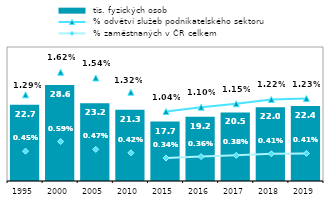
| Category |  tis. fyzických osob |
|---|---|
| 1995.0 | 22.729 |
| 2000.0 | 28.622 |
| 2005.0 | 23.2 |
| 2010.0 | 21.261 |
| 2015.0 | 17.733 |
| 2016.0 | 19.175 |
| 2017.0 | 20.459 |
| 2018.0 | 22.009 |
| 2019.0 | 22.383 |